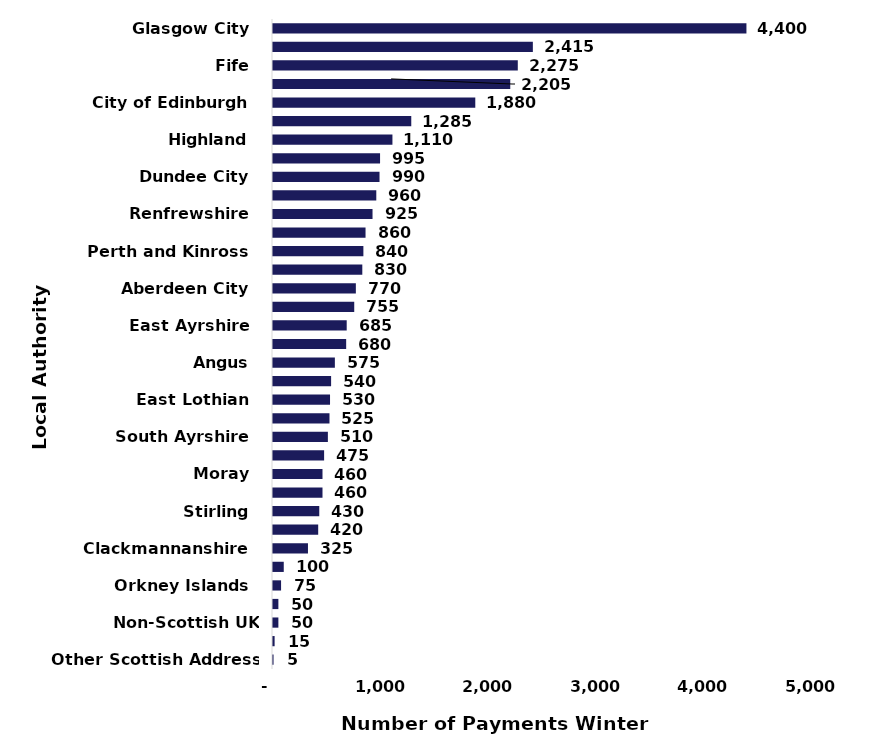
| Category | Number of Payments Winter 2023/2024 |
|---|---|
|  Glasgow City  | 4400 |
|  North Lanarkshire  | 2415 |
|  Fife  | 2275 |
|  South Lanarkshire  | 2205 |
|  City of Edinburgh  | 1880 |
|  West Lothian  | 1285 |
|  Highland  | 1110 |
|  Aberdeenshire  | 995 |
|  Dundee City  | 990 |
|  Falkirk  | 960 |
|  Renfrewshire  | 925 |
|  North Ayrshire  | 860 |
|  Perth and Kinross  | 840 |
|  Dumfries & Galloway  | 830 |
|  Aberdeen City  | 770 |
|  Midlothian  | 755 |
|  East Ayrshire  | 685 |
|  West Dunbartonshire  | 680 |
|  Angus  | 575 |
|  Inverclyde  | 540 |
|  East Lothian  | 530 |
|  East Renfrewshire  | 525 |
|  South Ayrshire  | 510 |
|  East Dunbartonshire  | 475 |
|  Moray  | 460 |
|  Scottish Borders  | 460 |
|  Stirling  | 430 |
|  Argyll & Bute  | 420 |
|  Clackmannanshire  | 325 |
|  Shetland Islands  | 100 |
|  Orkney Islands  | 75 |
|  Na h-Eileanan Siar  | 50 |
|  Non-Scottish UK Address  | 50 |
|  Unknown  | 15 |
|  Other Scottish Address  | 5 |